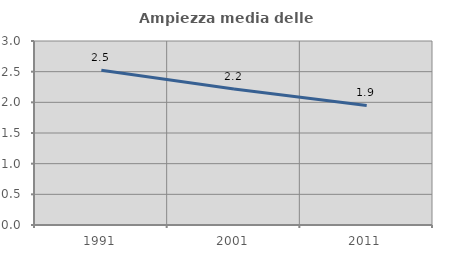
| Category | Ampiezza media delle famiglie |
|---|---|
| 1991.0 | 2.522 |
| 2001.0 | 2.216 |
| 2011.0 | 1.949 |